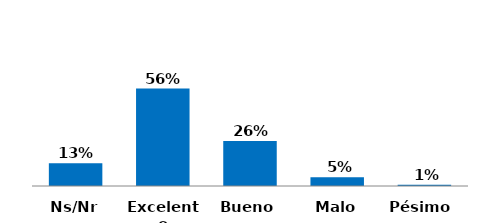
| Category | Series 0 |
|---|---|
| Pésimo  | 0.007 |
| Malo | 0.05 |
| Bueno | 0.257 |
| Excelente | 0.557 |
| Ns/Nr | 0.13 |